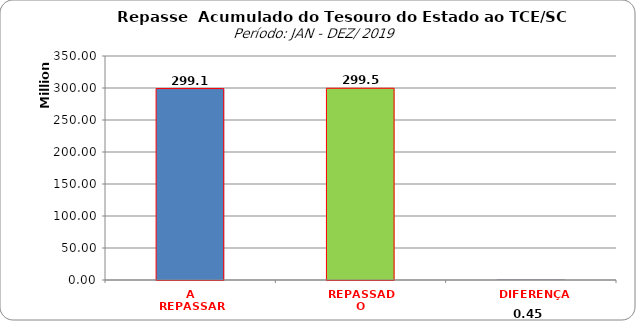
| Category | Series 0 |
|---|---|
| A REPASSAR | 299121438.08 |
| REPASSADO | 299572614.25 |
| DIFERENÇA | 451176.17 |